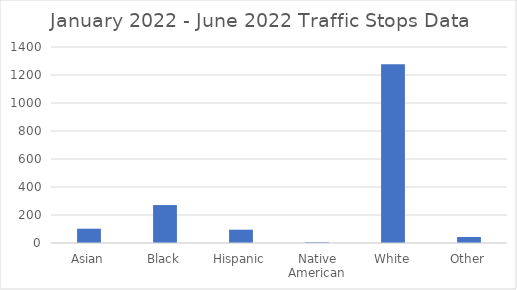
| Category | Series 0 |
|---|---|
| Asian | 102 |
| Black | 271 |
| Hispanic | 95 |
| Native American | 5 |
| White | 1277 |
| Other | 43 |